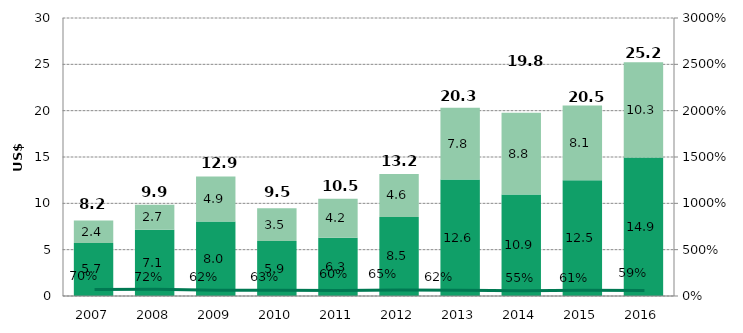
| Category | Funding | Unmet Requirements |
|---|---|---|
| 2007.0 | 5.724 | 2.431 |
| 2008.0 | 7.143 | 2.711 |
| 2009.0 | 8.044 | 4.856 |
| 2010.0 | 5.931 | 3.529 |
| 2011.0 | 6.29 | 4.206 |
| 2012.0 | 8.536 | 4.642 |
| 2013.0 | 12.567 | 7.753 |
| 2014.0 | 10.948 | 8.817 |
| 2015.0 | 12.491 | 8.055 |
| 2016.0 | 14.937 | 10.298 |